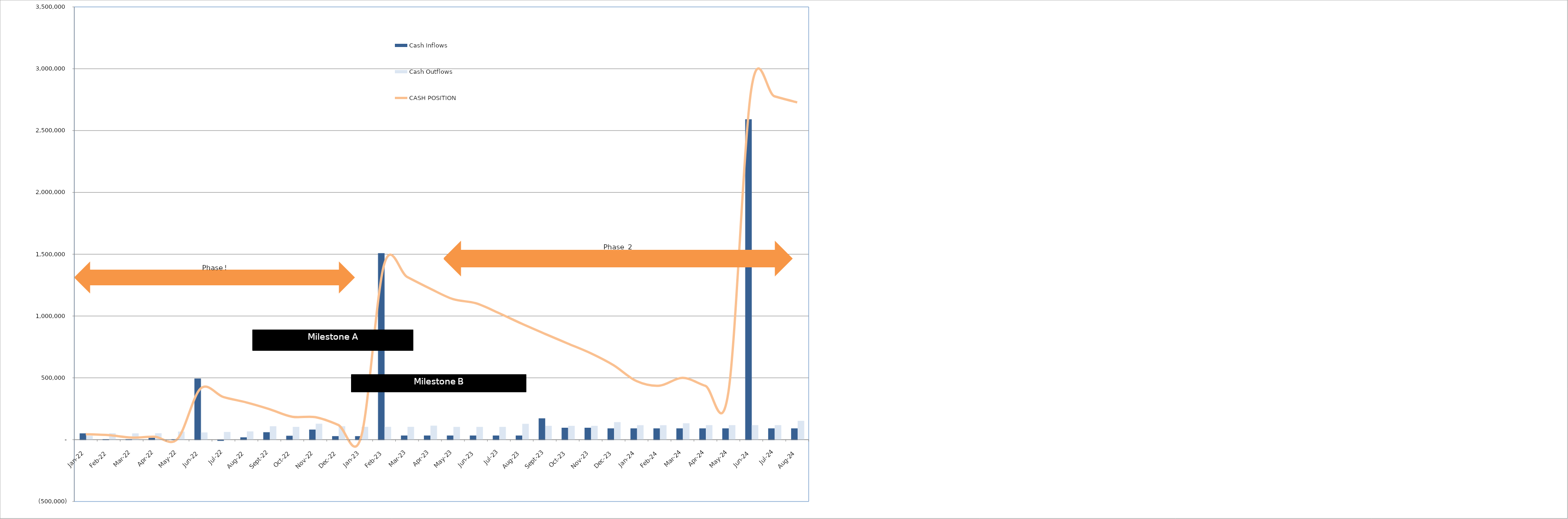
| Category | Cash Inflows | Cash Outflows |
|---|---|---|
| 2022-01-01 | 51000 | 31364.868 |
| 2022-02-01 | 4000 | 51761.331 |
| 2022-03-01 | 4000 | 50945.985 |
| 2022-04-01 | 29000 | 51931.823 |
| 2022-05-01 | 4000 | 65422.752 |
| 2022-06-01 | 494000 | 58411.517 |
| 2022-07-01 | -6000 | 62298.588 |
| 2022-08-01 | 19000 | 66797.911 |
| 2022-09-01 | 60315 | 108589.87 |
| 2022-10-01 | 31625 | 103569.903 |
| 2022-11-01 | 81625 | 128859.993 |
| 2022-12-01 | 28625 | 108839.223 |
| 2023-01-01 | 28625 | 103819.63 |
| 2023-02-01 | 1508625 | 103801.856 |
| 2023-03-01 | 33625 | 103794.801 |
| 2023-04-01 | 33625 | 113278.325 |
| 2023-05-01 | 33625 | 103260.36 |
| 2023-06-01 | 33625 | 103243.459 |
| 2023-07-01 | 33625 | 103227.076 |
| 2023-08-01 | 33625 | 128210.689 |
| 2023-09-01 | 172615 | 111990.392 |
| 2023-10-01 | 96425 | 111963.664 |
| 2023-11-01 | 96425 | 111956.003 |
| 2023-12-01 | 91425 | 141969.083 |
| 2024-01-01 | 91425 | 117075.696 |
| 2024-02-01 | 91425 | 117064.63 |
| 2024-03-01 | 91425 | 132575.691 |
| 2024-04-01 | 91425 | 117563.708 |
| 2024-05-01 | 91425 | 117553.258 |
| 2024-06-01 | 2591425 | 117543.588 |
| 2024-07-01 | 91425 | 117533.915 |
| 2024-08-01 | 91425 | 152524.24 |